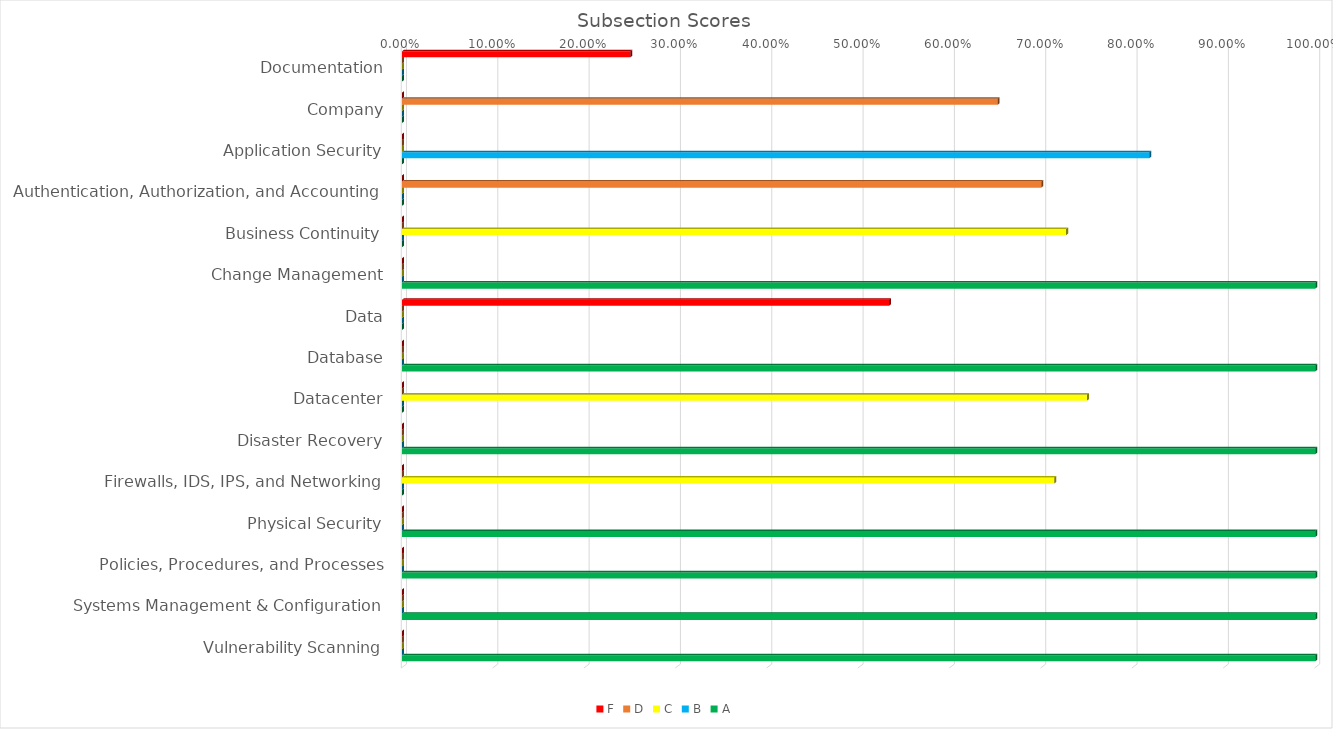
| Category | F | D | C | B | A |
|---|---|---|---|---|---|
| Documentation | 0.25 | 0 | 0 | 0 | 0 |
| Company | 0 | 0.652 | 0 | 0 | 0 |
| Application Security | 0 | 0 | 0 | 0.818 | 0 |
| Authentication, Authorization, and Accounting | 0 | 0.7 | 0 | 0 | 0 |
| Business Continuity | 0 | 0 | 0.727 | 0 | 0 |
| Change Management | 0 | 0 | 0 | 0 | 1 |
| Data | 0.533 | 0 | 0 | 0 | 0 |
| Database | 0 | 0 | 0 | 0 | 1 |
| Datacenter | 0 | 0 | 0.75 | 0 | 0 |
| Disaster Recovery | 0 | 0 | 0 | 0 | 1 |
| Firewalls, IDS, IPS, and Networking | 0 | 0 | 0.714 | 0 | 0 |
| Physical Security | 0 | 0 | 0 | 0 | 1 |
| Policies, Procedures, and Processes | 0 | 0 | 0 | 0 | 1 |
| Systems Management & Configuration | 0 | 0 | 0 | 0 | 1 |
| Vulnerability Scanning | 0 | 0 | 0 | 0 | 1 |